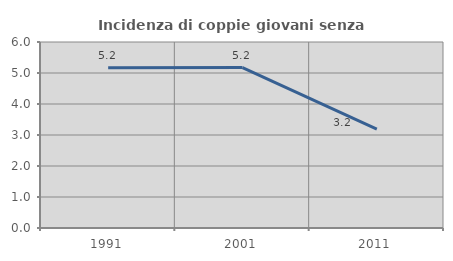
| Category | Incidenza di coppie giovani senza figli |
|---|---|
| 1991.0 | 5.168 |
| 2001.0 | 5.174 |
| 2011.0 | 3.19 |